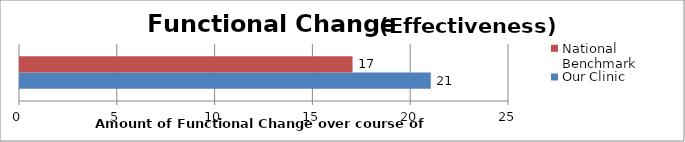
| Category | Our Clinic   | National Benchmark    |
|---|---|---|
| 0 | 21 | 17 |